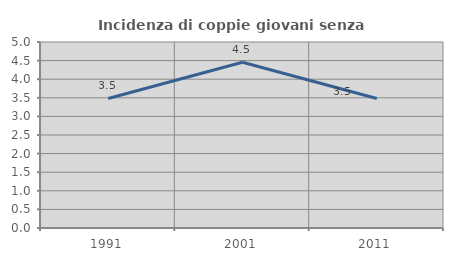
| Category | Incidenza di coppie giovani senza figli |
|---|---|
| 1991.0 | 3.483 |
| 2001.0 | 4.455 |
| 2011.0 | 3.483 |